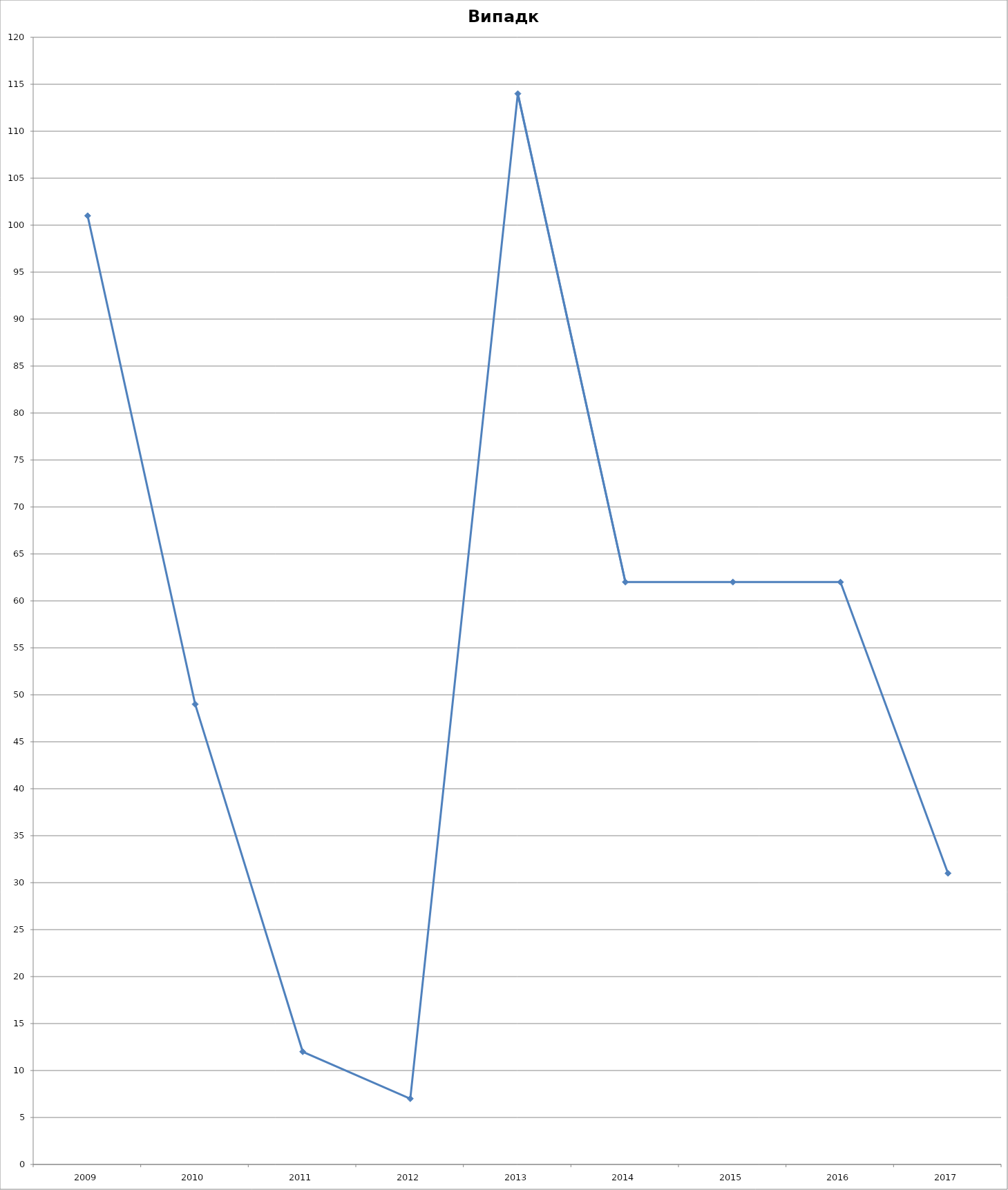
| Category | Випадки |
|---|---|
| 2009.0 | 101 |
| 2010.0 | 49 |
| 2011.0 | 12 |
| 2012.0 | 7 |
| 2013.0 | 114 |
| 2014.0 | 62 |
| 2015.0 | 62 |
| 2016.0 | 62 |
| 2017.0 | 31 |